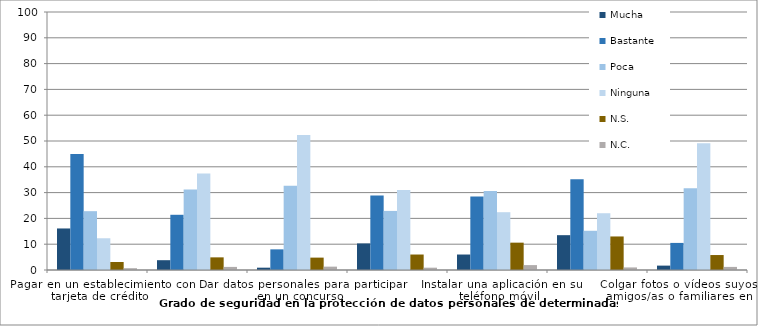
| Category | Mucha | Bastante | Poca | Ninguna | N.S. | N.C. |
|---|---|---|---|---|---|---|
| Pagar en un establecimiento con tarjeta de crédito | 16.1 | 45 | 22.8 | 12.3 | 3.1 | 0.7 |
| Dar el número de su tarjeta por Internet para realizar alguna compra | 3.8 | 21.4 | 31.2 | 37.4 | 4.9 | 1.2 |
| Dar datos personales para participar en un concurso | 0.9 | 8 | 32.7 | 52.3 | 4.8 | 1.3 |
| Realizar operaciones bancarias por Internet | 10.3 | 28.9 | 22.9 | 31 | 6 | 0.9 |
| Instalar una aplicación en su teléfono móvil | 6 | 28.5 | 30.6 | 22.4 | 10.6 | 1.9 |
| Hacer la declaración de la renta por Internet | 13.5 | 35.2 | 15.2 | 22 | 13 | 1 |
| Colgar fotos o vídeos suyos o de sus amigos/as o familiares en Internet | 1.7 | 10.5 | 31.7 | 49.1 | 5.8 | 1.2 |